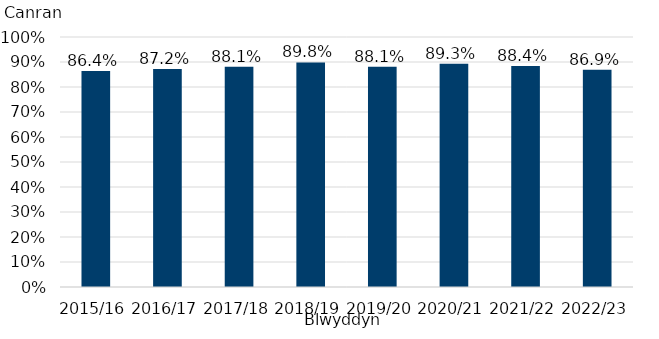
| Category | % sy'n trosglwyddo i addysg gynradd cyfrwng Gymraeg |
|---|---|
| 2015/16 | 0.864 |
| 2016/17 | 0.872 |
| 2017/18 | 0.881 |
| 2018/19 | 0.898 |
| 2019/20 | 0.881 |
| 2020/21 | 0.893 |
| 2021/22 | 0.884 |
| 2022/23 | 0.869 |